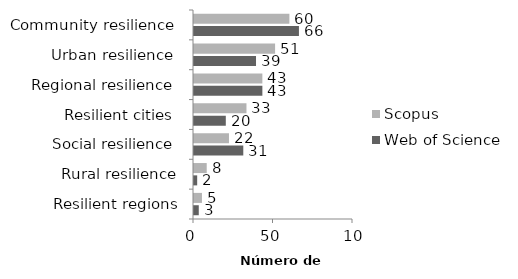
| Category | Web of Science | Scopus |
|---|---|---|
| Resilient regions | 3 | 5 |
| Rural resilience | 2 | 8 |
| Social resilience  | 31 | 22 |
| Resilient cities  | 20 | 33 |
| Regional resilience  | 43 | 43 |
| Urban resilience  | 39 | 51 |
| Community resilience  | 66 | 60 |